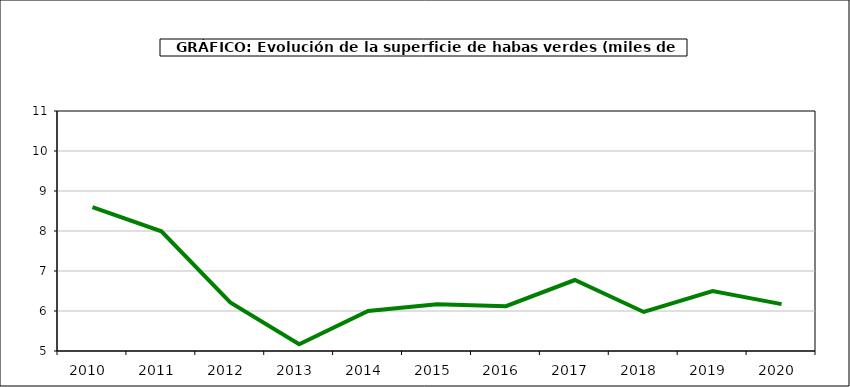
| Category | superficie |
|---|---|
| 2010.0 | 8.595 |
| 2011.0 | 7.993 |
| 2012.0 | 6.216 |
| 2013.0 | 5.17 |
| 2014.0 | 6.001 |
| 2015.0 | 6.169 |
| 2016.0 | 6.119 |
| 2017.0 | 6.774 |
| 2018.0 | 5.976 |
| 2019.0 | 6.497 |
| 2020.0 | 6.172 |